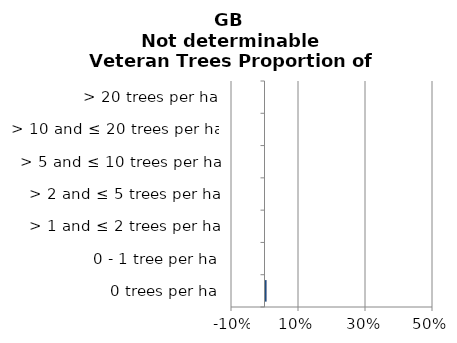
| Category | England | Scotland | Wales |
|---|---|---|---|
| 0 trees per ha | 0.001 | 0.006 | 0 |
| 0 - 1 tree per ha | 0 | 0 | 0 |
| > 1 and ≤ 2 trees per ha | 0 | 0 | 0 |
| > 2 and ≤ 5 trees per ha | 0 | 0 | 0 |
| > 5 and ≤ 10 trees per ha | 0 | 0 | 0 |
| > 10 and ≤ 20 trees per ha | 0 | 0 | 0 |
| > 20 trees per ha | 0 | 0 | 0 |